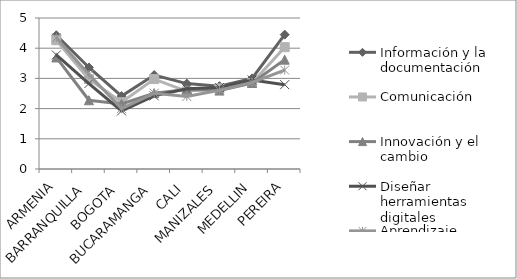
| Category | Información y la documentación | Comunicación | Innovación y el cambio | Diseñar herramientas digitales | Aprendizaje organizacional |
|---|---|---|---|---|---|
| ARMENIA | 4.429 | 4.265 | 3.694 | 3.776 | 4.347 |
| BARRANQUILLA | 3.362 | 2.979 | 2.277 | 2.83 | 3.128 |
| BOGOTA | 2.413 | 2.212 | 2.154 | 1.923 | 2 |
| BUCARAMANGA | 3.111 | 2.978 | 2.511 | 2.422 | 2.511 |
| CALI | 2.829 | 2.571 | 2.629 | 2.657 | 2.4 |
| MANIZALES | 2.743 | 2.67 | 2.596 | 2.697 | 2.606 |
| MEDELLIN | 3 | 2.847 | 2.847 | 2.949 | 2.864 |
| PEREIRA | 4.448 | 4.034 | 3.621 | 2.793 | 3.276 |